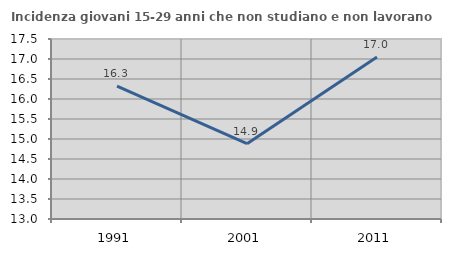
| Category | Incidenza giovani 15-29 anni che non studiano e non lavorano  |
|---|---|
| 1991.0 | 16.322 |
| 2001.0 | 14.883 |
| 2011.0 | 17.05 |